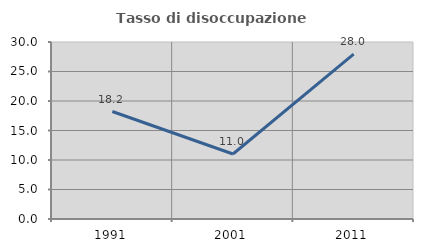
| Category | Tasso di disoccupazione giovanile  |
|---|---|
| 1991.0 | 18.214 |
| 2001.0 | 11.018 |
| 2011.0 | 27.957 |